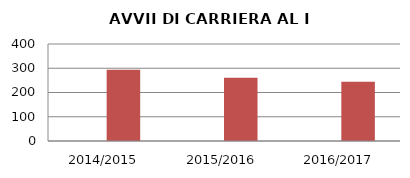
| Category | ANNO | NUMERO |
|---|---|---|
| 2014/2015 | 0 | 294 |
| 2015/2016 | 0 | 261 |
| 2016/2017 | 0 | 244 |